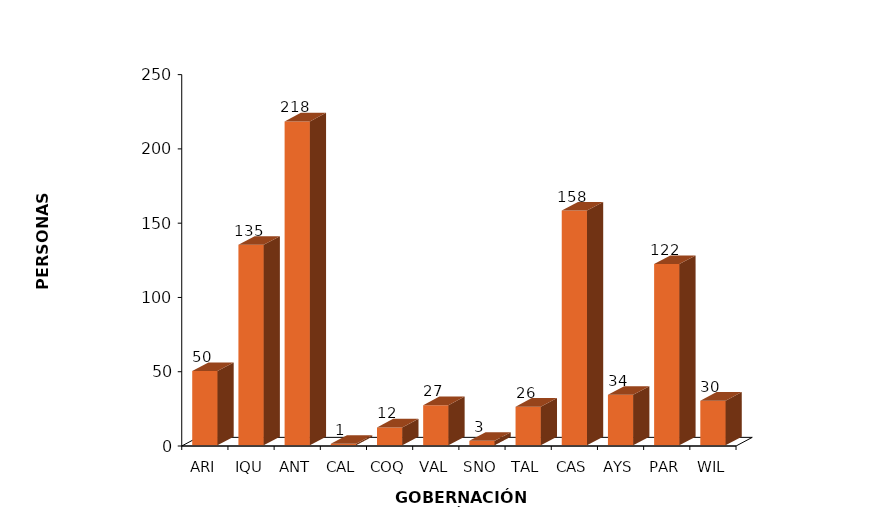
| Category | Series 0 |
|---|---|
| ARI | 50 |
| IQU | 135 |
| ANT | 218 |
| CAL | 1 |
| COQ | 12 |
| VAL | 27 |
| SNO | 3 |
| TAL | 26 |
| CAS | 158 |
| AYS | 34 |
| PAR | 122 |
| WIL | 30 |